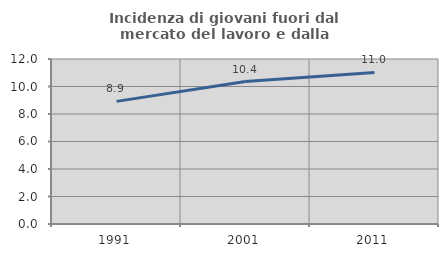
| Category | Incidenza di giovani fuori dal mercato del lavoro e dalla formazione  |
|---|---|
| 1991.0 | 8.919 |
| 2001.0 | 10.357 |
| 2011.0 | 11.019 |